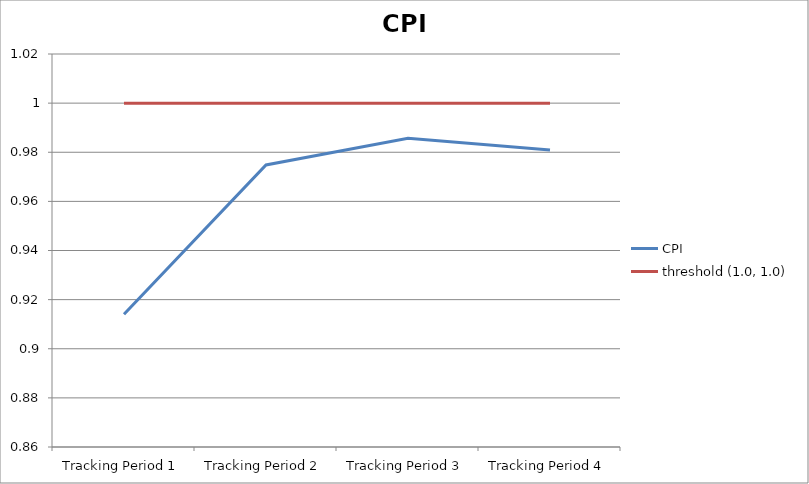
| Category | CPI | threshold (1.0, 1.0) |
|---|---|---|
| Tracking Period 1 | 0.914 | 1 |
| Tracking Period 2 | 0.975 | 1 |
| Tracking Period 3 | 0.986 | 1 |
| Tracking Period 4 | 0.981 | 1 |